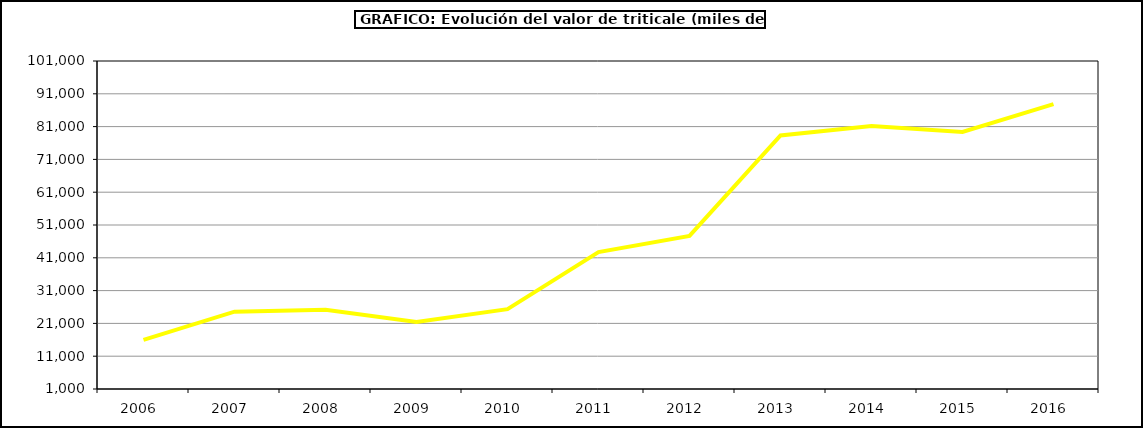
| Category | Producción |
|---|---|
| 2006.0 | 15958.653 |
| 2007.0 | 24583.25 |
| 2008.0 | 25178.261 |
| 2009.0 | 21396.86 |
| 2010.0 | 25344.427 |
| 2011.0 | 42728.352 |
| 2012.0 | 47678.033 |
| 2013.0 | 78279.322 |
| 2014.0 | 81166 |
| 2015.0 | 79377 |
| 2016.0 | 87859 |